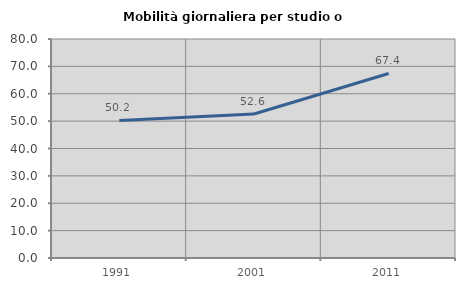
| Category | Mobilità giornaliera per studio o lavoro |
|---|---|
| 1991.0 | 50.229 |
| 2001.0 | 52.615 |
| 2011.0 | 67.407 |